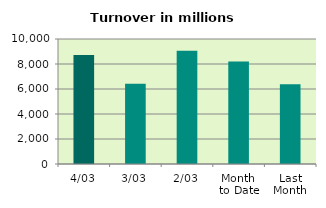
| Category | Series 0 |
|---|---|
| 4/03 | 8712.561 |
| 3/03 | 6417.536 |
| 2/03 | 9059.072 |
| Month 
to Date | 8198.695 |
| Last
Month | 6378.947 |